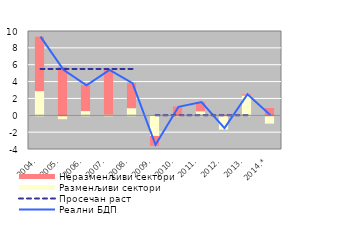
| Category | Разменљиви сектори | Неразменљиви сектори |
|---|---|---|
| 2004. | 2.981 | 6.351 |
| 2005. | -0.344 | 5.747 |
| 2006. | 0.615 | 2.942 |
| 2007. | 0.186 | 5.196 |
| 2008. | 0.953 | 2.866 |
| 2009. | -2.448 | -1.057 |
| 2010. | -0.035 | 1.042 |
| 2011. | 0.581 | 0.986 |
| 2012. | -1.582 | 0.059 |
| 2013. | 2.443 | 0.054 |
| 2014.* | -0.871 | 0.87 |